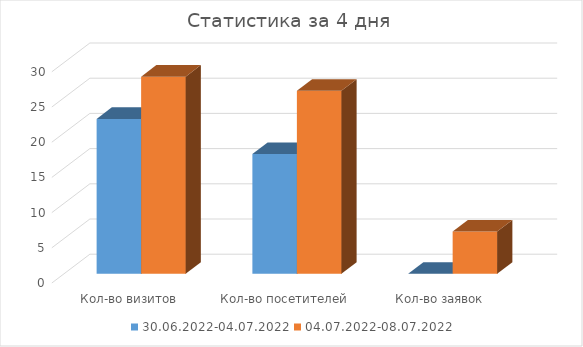
| Category | 30.06.2022-04.07.2022 | 04.07.2022-08.07.2022 |
|---|---|---|
| Кол-во визитов | 22 | 28 |
| Кол-во посетителей | 17 | 26 |
| Кол-во заявок | 0 | 6 |